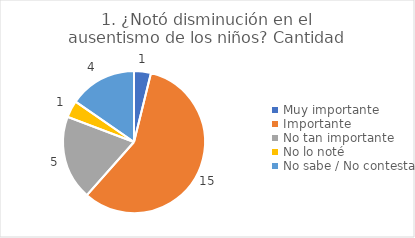
| Category | 1. ¿Notó disminución en el ausentismo de los niños? |
|---|---|
| Muy importante  | 0.038 |
| Importante  | 0.577 |
| No tan importante  | 0.192 |
| No lo noté  | 0.038 |
| No sabe / No contesta | 0.154 |